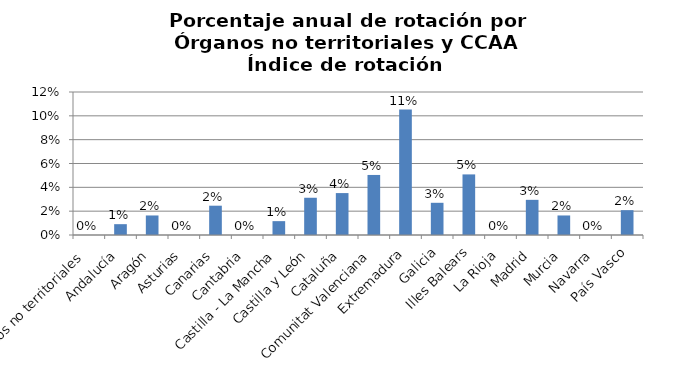
| Category | Porcentaje |
|---|---|
| Órganos no territoriales | 0 |
| Andalucía | 0.009 |
| Aragón | 0.016 |
| Asturias | 0 |
| Canarias | 0.025 |
| Cantabria | 0 |
| Castilla - La Mancha | 0.012 |
| Castilla y León | 0.031 |
| Cataluña | 0.035 |
| Comunitat Valenciana | 0.05 |
| Extremadura | 0.105 |
| Galicia | 0.027 |
| Illes Balears | 0.051 |
| La Rioja | 0 |
| Madrid | 0.03 |
| Murcia | 0.016 |
| Navarra | 0 |
| País Vasco | 0.021 |